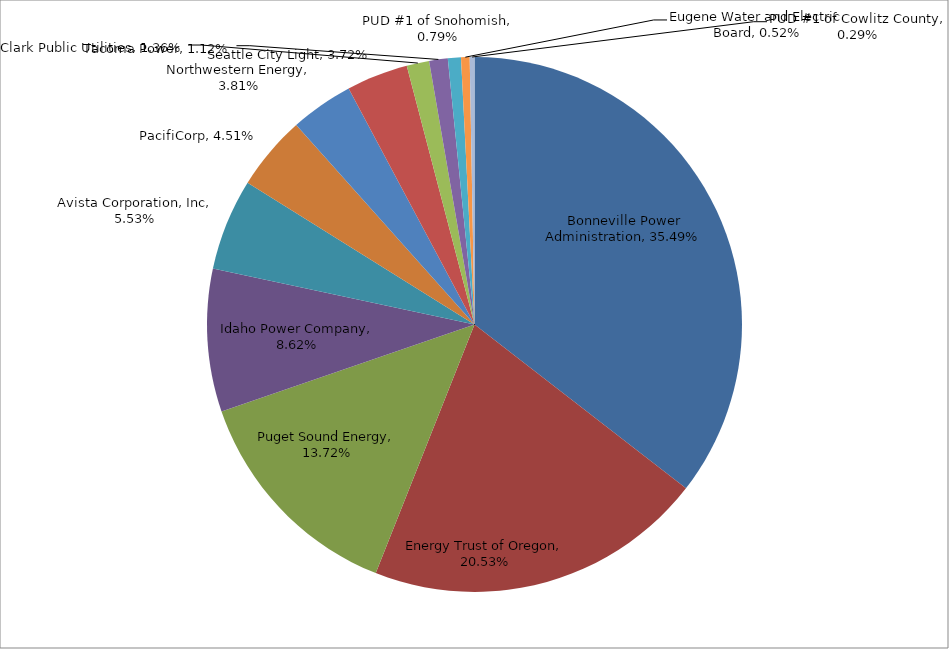
| Category | Series 0 |
|---|---|
| Bonneville Power Administration | 0.355 |
| Energy Trust of Oregon | 0.205 |
| Puget Sound Energy | 0.137 |
| Idaho Power Company | 0.086 |
| Avista Corporation, Inc | 0.055 |
| PacifiCorp | 0.045 |
| Northwestern Energy | 0.038 |
| Seattle City Light | 0.037 |
| Clark Public Utilities | 0.014 |
| Tacoma Power | 0.011 |
| PUD #1 of Snohomish | 0.008 |
| Eugene Water and Electric Board | 0.005 |
| PUD #1 of Cowlitz County | 0.003 |